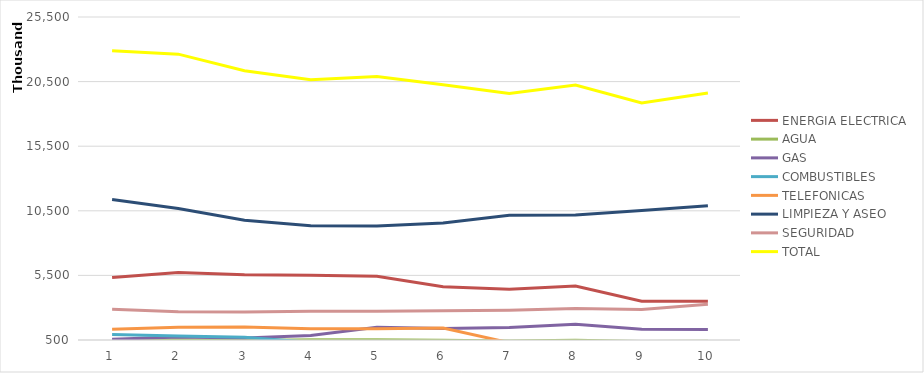
| Category | ENERGIA ELECTRICA | AGUA | GAS | COMBUSTIBLES | TELEFONICAS | LIMPIEZA Y ASEO | SEGURIDAD | TOTAL |
|---|---|---|---|---|---|---|---|---|
| 0 | 5344093.24 | 481542.49 | 550637.36 | 916994.02 | 1341481.37 | 11376013.49 | 2874879.15 | 22885641.12 |
| 1 | 5717816.03 | 521464.47 | 727129.1 | 818822.05 | 1477255.81 | 10670231.78 | 2692955.56 | 22625674.8 |
| 2 | 5558877.72 | 469020.08 | 653634.1 | 715218.99 | 1499929.02 | 9763423.91 | 2676149.46 | 21336253.28 |
| 3 | 5516737.94 | 512523.83 | 855317.59 | 319635.26 | 1375591.82 | 9336197.81 | 2731804.78 | 20647809.03 |
| 4 | 5432434.75 | 509733.78 | 1481455.23 | 50923.19 | 1371835.12 | 9313981.68 | 2728487.81 | 20888851.56 |
| 5 | 4627069.99 | 490295.18 | 1386528.75 | 19959.96 | 1431552.48 | 9552283.15 | 2755671.33 | 20263360.84 |
| 6 | 4419606.73 | 424493.69 | 1459805.99 | 19038.55 | 291590.62 | 10157503.91 | 2808644.14 | 19580683.63 |
| 7 | 4671696.86 | 484667.68 | 1714136.78 | 17524.17 | 244120.25 | 10170273.21 | 2928586.87 | 20231005.82 |
| 8 | 3508237.11 | 393159.46 | 1339225.44 | 14839.44 | 201087.96 | 10520451.58 | 2865175.91 | 18842176.9 |
| 9 | 3501032.66 | 397301.84 | 1315658.04 | 18977.72 | 222037.41 | 10892254.98 | 3271124.75 | 19618387.4 |